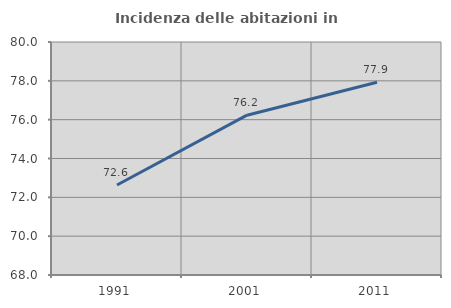
| Category | Incidenza delle abitazioni in proprietà  |
|---|---|
| 1991.0 | 72.633 |
| 2001.0 | 76.231 |
| 2011.0 | 77.923 |